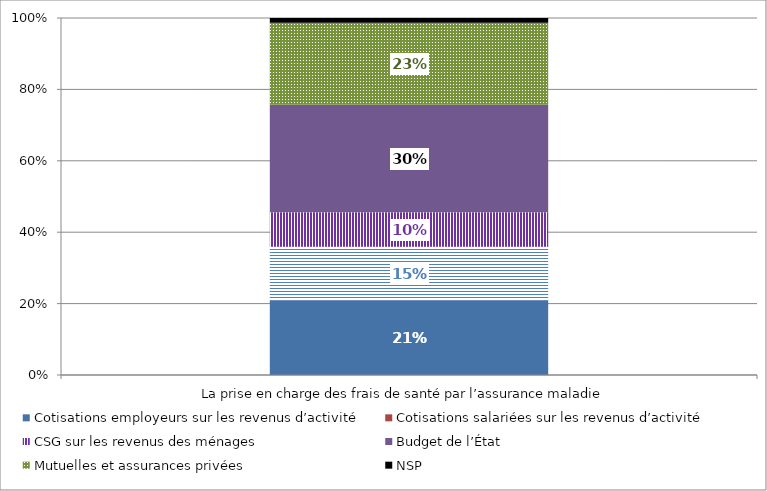
| Category | Cotisations employeurs sur les revenus d’activité | Cotisations salariées sur les revenus d’activité | CSG sur les revenus des ménages | Budget de l’État | Mutuelles et assurances privées | NSP |
|---|---|---|---|---|---|---|
| La prise en charge des frais de santé par l’assurance maladie | 0.209 | 0.15 | 0.097 | 0.301 | 0.23 | 0.013 |